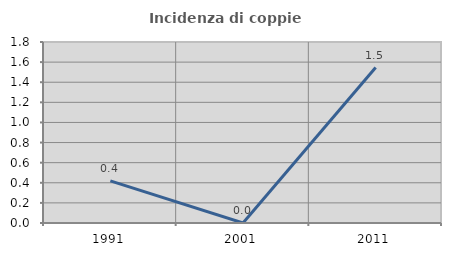
| Category | Incidenza di coppie miste |
|---|---|
| 1991.0 | 0.418 |
| 2001.0 | 0 |
| 2011.0 | 1.546 |